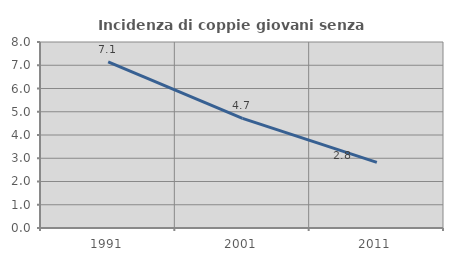
| Category | Incidenza di coppie giovani senza figli |
|---|---|
| 1991.0 | 7.143 |
| 2001.0 | 4.717 |
| 2011.0 | 2.823 |